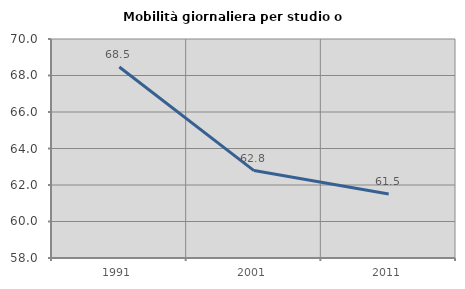
| Category | Mobilità giornaliera per studio o lavoro |
|---|---|
| 1991.0 | 68.468 |
| 2001.0 | 62.791 |
| 2011.0 | 61.506 |